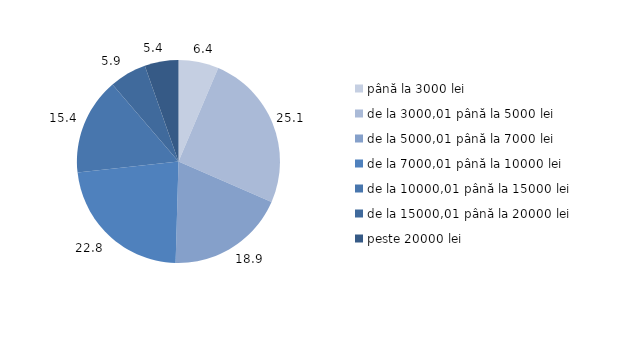
| Category | Series 0 |
|---|---|
| până la 3000 lei | 6.401 |
| de la 3000,01 până la 5000 lei | 25.15 |
| de la 5000,01 până la 7000 lei | 18.902 |
| de la 7000,01 până la 10000 lei | 22.827 |
| de la 10000,01 până la 15000 lei | 15.45 |
| de la 15000,01 până la 20000 lei | 5.884 |
| peste 20000 lei | 5.387 |